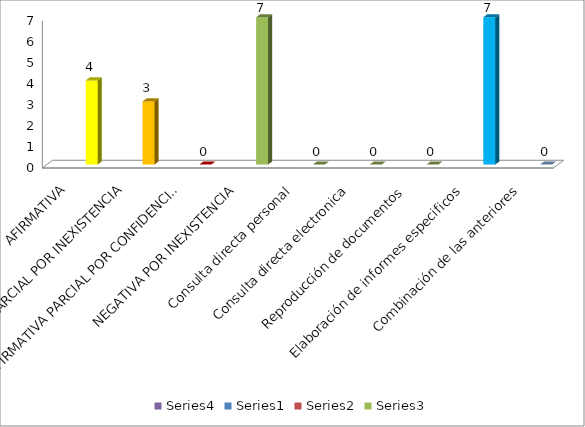
| Category | Series 3 | Series 0 | Series 1 | Series 2 |
|---|---|---|---|---|
| AFIRMATIVA |  |  |  | 4 |
| AFIRMATIVA PARCIAL POR INEXISTENCIA |  |  |  | 3 |
| AFIRMATIVA PARCIAL POR CONFIDENCIALIDAD |  |  |  | 0 |
| NEGATIVA POR INEXISTENCIA |  |  |  | 7 |
| Consulta directa personal |  |  |  | 0 |
| Consulta directa electronica |  |  |  | 0 |
| Reproducción de documentos |  |  |  | 0 |
| Elaboración de informes especificos |  |  |  | 7 |
| Combinación de las anteriores |  |  |  | 0 |